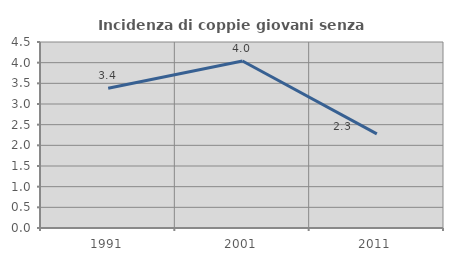
| Category | Incidenza di coppie giovani senza figli |
|---|---|
| 1991.0 | 3.379 |
| 2001.0 | 4.04 |
| 2011.0 | 2.278 |